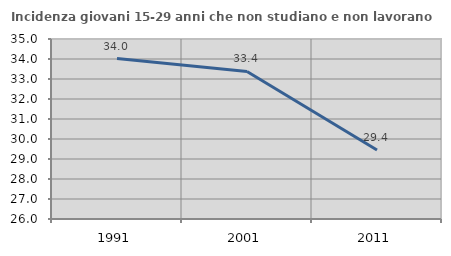
| Category | Incidenza giovani 15-29 anni che non studiano e non lavorano  |
|---|---|
| 1991.0 | 34.021 |
| 2001.0 | 33.376 |
| 2011.0 | 29.447 |